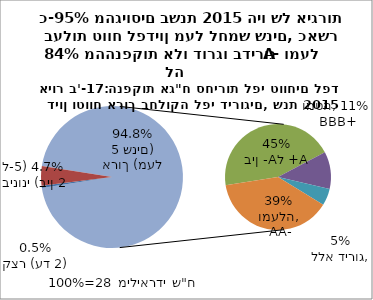
| Category | Series 0 |
|---|---|
| קצר (עד שנתיים) | 0.005 |
| בינוני (בין 2 ל-5 שנים) | 0.047 |
| בין -A ל +A | 0.447 |
| BBB+ ומטה | 0.113 |
| ללא דירוג | 0.051 |
| AA- ומעלה | 0.388 |